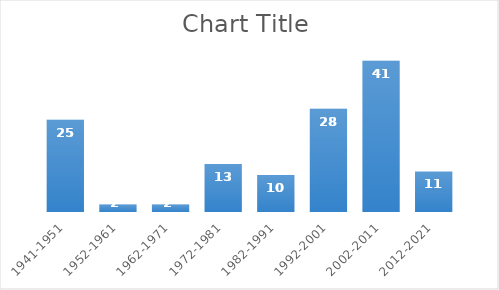
| Category | Series 0 |
|---|---|
| 1941-1951 | 25 |
| 1952-1961 | 2 |
| 1962-1971 | 2 |
| 1972-1981 | 13 |
| 1982-1991 | 10 |
| 1992-2001 | 28 |
| 2002-2011 | 41 |
| 2012-2021 | 11 |